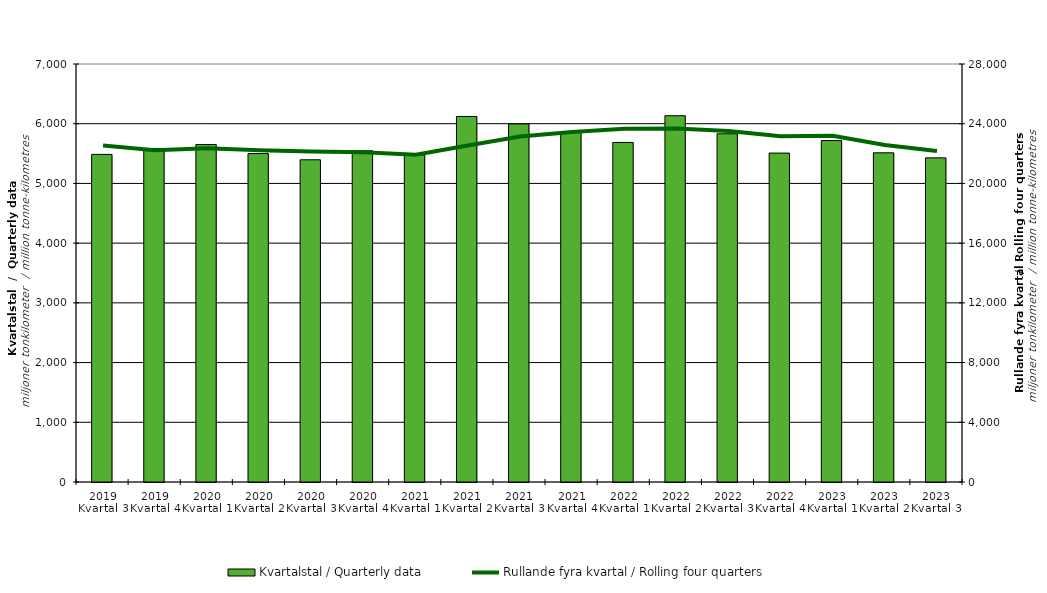
| Category | Kvartalstal / Quarterly data |
|---|---|
| 2019 Kvartal 3 | 5486.395 |
| 2019 Kvartal 4 | 5584.286 |
| 2020 Kvartal 1 | 5650.915 |
| 2020 Kvartal 2 | 5500.334 |
| 2020 Kvartal 3 | 5395.987 |
| 2020 Kvartal 4 | 5546.662 |
| 2021 Kvartal 1 | 5476.427 |
| 2021 Kvartal 2 | 6121.807 |
| 2021 Kvartal 3 | 5996.688 |
| 2021 Kvartal 4 | 5853.966 |
| 2022 Kvartal 1 | 5686.696 |
| 2022 Kvartal 2 | 6134.1 |
| 2022 Kvartal 3 | 5831.909 |
| 2022 Kvartal 4 | 5508.231 |
| 2023 Kvartal 1 | 5717.368 |
| 2023 Kvartal 2 | 5512.865 |
| 2023 Kvartal 3 | 5428.06 |